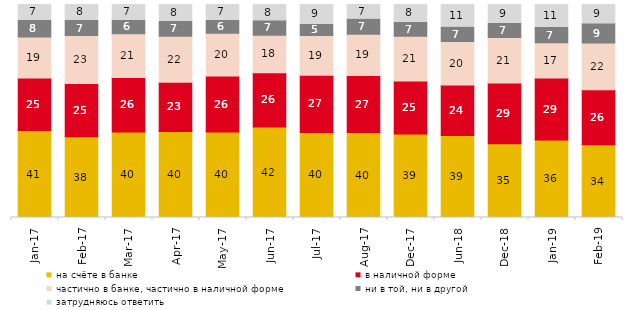
| Category | на счёте в банке | в наличной форме | частично в банке, частично в наличной форме | ни в той, ни в другой | затрудняюсь ответить |
|---|---|---|---|---|---|
| 2017-01-01 | 40.8 | 24.65 | 19.25 | 7.95 | 7.35 |
| 2017-02-01 | 37.9 | 25 | 22.5 | 7.1 | 7.5 |
| 2017-03-01 | 40.1 | 25.65 | 20.55 | 6.3 | 7.4 |
| 2017-04-01 | 40.4 | 23.05 | 21.7 | 6.95 | 7.9 |
| 2017-05-01 | 40.1 | 26.3 | 20.05 | 6.15 | 7.4 |
| 2017-06-01 | 42.45 | 25.5 | 17.65 | 6.75 | 7.65 |
| 2017-07-01 | 39.95 | 26.8 | 18.7 | 5.3 | 9.25 |
| 2017-08-01 | 39.85 | 26.8 | 19.35 | 7.25 | 6.75 |
| 2017-12-01 | 39.2 | 24.85 | 21.05 | 6.55 | 8.3 |
| 2018-06-01 | 38.5 | 23.65 | 20.45 | 6.8 | 10.6 |
| 2018-12-01 | 34.6 | 28.55 | 21.35 | 6.65 | 8.85 |
| 2019-01-01 | 36.35 | 29.1 | 16.55 | 7.35 | 10.65 |
| 2019-02-01 | 34.2 | 25.75 | 22 | 9.05 | 9 |